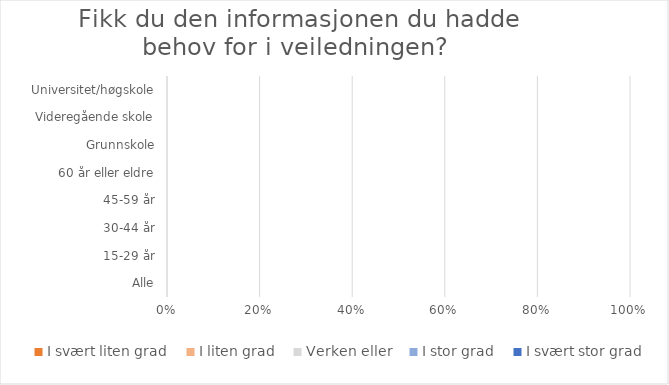
| Category | I svært liten grad | I liten grad | Verken eller | I stor grad | I svært stor grad |
|---|---|---|---|---|---|
| Alle | 0 | 0 | 0 | 0 | 0 |
| 15-29 år | 0 | 0 | 0 | 0 | 0 |
| 30-44 år | 0 | 0 | 0 | 0 | 0 |
| 45-59 år | 0 | 0 | 0 | 0 | 0 |
| 60 år eller eldre | 0 | 0 | 0 | 0 | 0 |
| Grunnskole | 0 | 0 | 0 | 0 | 0 |
| Videregående skole | 0 | 0 | 0 | 0 | 0 |
| Universitet/høgskole | 0 | 0 | 0 | 0 | 0 |